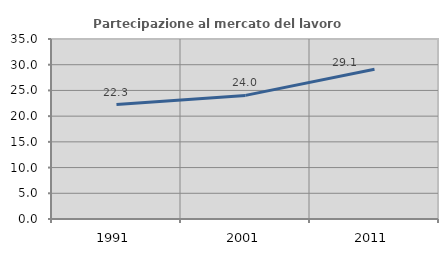
| Category | Partecipazione al mercato del lavoro  femminile |
|---|---|
| 1991.0 | 22.262 |
| 2001.0 | 24.034 |
| 2011.0 | 29.136 |